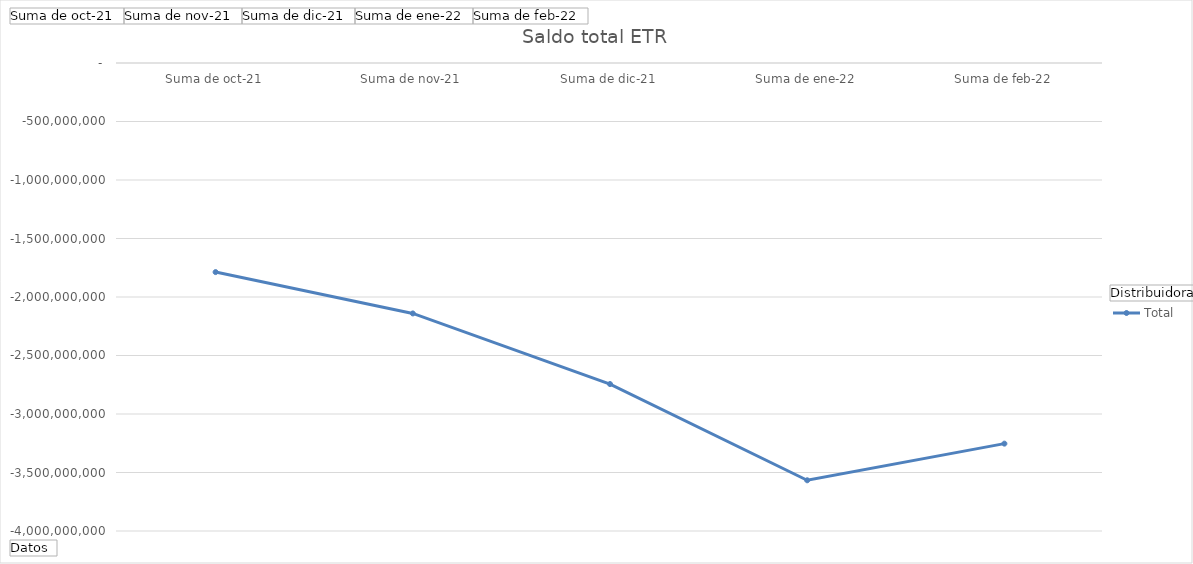
| Category | Total |
|---|---|
| Suma de oct-21 | -1787102245.194 |
| Suma de nov-21 | -2140589007.684 |
| Suma de dic-21 | -2743862912.885 |
| Suma de ene-22 | -3566509892.24 |
| Suma de feb-22 | -3253321093.628 |